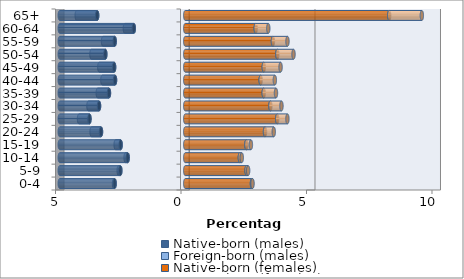
| Category | Native-born (males) | Foreign-born (males) | Native-born (females) | Foreign-born (females) |
|---|---|---|---|---|
| 0-4 | -2.814 | -0.025 | 2.656 | 0.024 |
| 5-9 | -2.586 | -0.065 | 2.444 | 0.062 |
| 10-14 | -2.294 | -0.083 | 2.175 | 0.077 |
| 15-19 | -2.574 | -0.199 | 2.434 | 0.182 |
| 20-24 | -3.357 | -0.374 | 3.178 | 0.349 |
| 25-29 | -3.816 | -0.416 | 3.663 | 0.407 |
| 30-34 | -3.435 | -0.422 | 3.393 | 0.44 |
| 35-39 | -3.04 | -0.446 | 3.126 | 0.489 |
| 40-44 | -2.797 | -0.504 | 3.005 | 0.564 |
| 45-49 | -2.834 | -0.591 | 3.128 | 0.669 |
| 50-54 | -3.184 | -0.553 | 3.669 | 0.645 |
| 55-59 | -2.811 | -0.464 | 3.493 | 0.579 |
| 60-64 | -2.05 | -0.356 | 2.808 | 0.5 |
| 65+ | -3.509 | -0.815 | 8.126 | 1.3 |